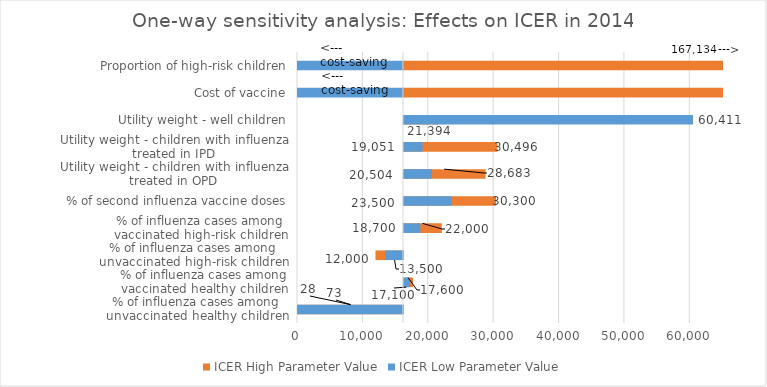
| Category | ICER High Parameter Value | ICER Low Parameter Value |
|---|---|---|
| % of influenza cases among unvaccinated healthy children | 73 | 28 |
| % of influenza cases among vaccinated healthy children | 17600 | 17100 |
| % of influenza cases among unvaccinated high-risk children | 12000 | 13500 |
| % of influenza cases among vaccinated high-risk children | 22000 | 18700 |
| % of second influenza vaccine doses | 30300 | 23500 |
| Utility weight - children with influenza treated in OPD | 28683 | 20504 |
| Utility weight - children with influenza treated in IPD | 30496 | 19051 |
| Utility weight - well children | 21394 | 60411 |
| Cost of vaccine | 65000 | 0 |
| Proportion of high-risk children | 65000 | 0 |